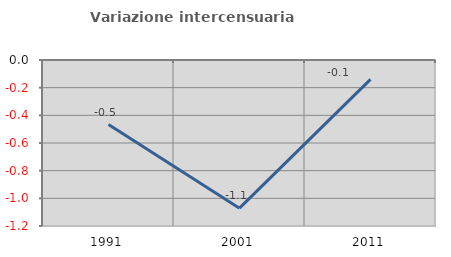
| Category | Variazione intercensuaria annua |
|---|---|
| 1991.0 | -0.467 |
| 2001.0 | -1.071 |
| 2011.0 | -0.14 |